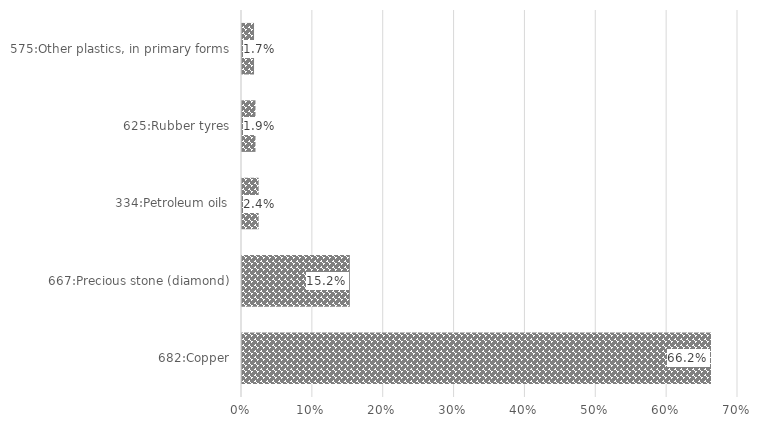
| Category | %Share |
|---|---|
| 682:Copper | 0.662 |
| 667:Precious stone (diamond) | 0.152 |
| 334:Petroleum oils | 0.024 |
| 625:Rubber tyres | 0.019 |
| 575:Other plastics, in primary forms | 0.017 |